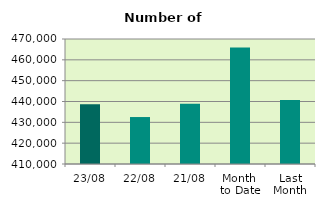
| Category | Series 0 |
|---|---|
| 23/08 | 438708 |
| 22/08 | 432540 |
| 21/08 | 438922 |
| Month 
to Date | 465939.412 |
| Last
Month | 440756.667 |